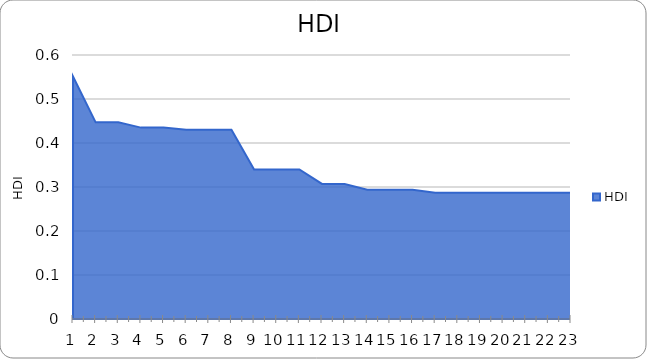
| Category | HDI |
|---|---|
| 0 | 0.551 |
| 1 | 0.447 |
| 2 | 0.447 |
| 3 | 0.435 |
| 4 | 0.435 |
| 5 | 0.43 |
| 6 | 0.43 |
| 7 | 0.43 |
| 8 | 0.34 |
| 9 | 0.34 |
| 10 | 0.34 |
| 11 | 0.307 |
| 12 | 0.307 |
| 13 | 0.294 |
| 14 | 0.294 |
| 15 | 0.294 |
| 16 | 0.287 |
| 17 | 0.287 |
| 18 | 0.287 |
| 19 | 0.287 |
| 20 | 0.287 |
| 21 | 0.287 |
| 22 | 0.287 |